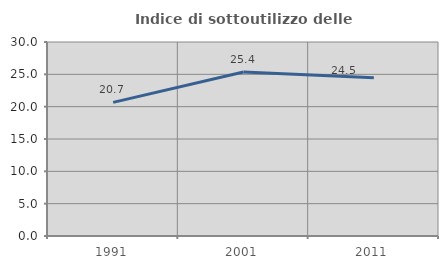
| Category | Indice di sottoutilizzo delle abitazioni  |
|---|---|
| 1991.0 | 20.662 |
| 2001.0 | 25.352 |
| 2011.0 | 24.456 |